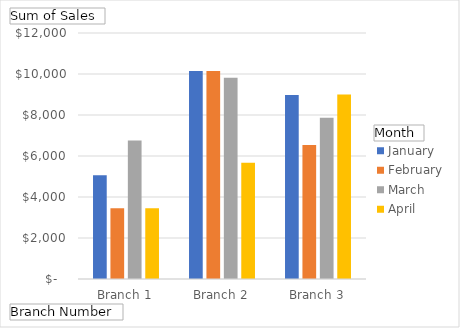
| Category | January | February | March | April |
|---|---|---|---|---|
| Branch 1 | 5060 | 3456 | 6753 | 3452 |
| Branch 2 | 10152 | 10152 | 9812 | 5674 |
| Branch 3 | 8976 | 6537 | 7865 | 9000 |